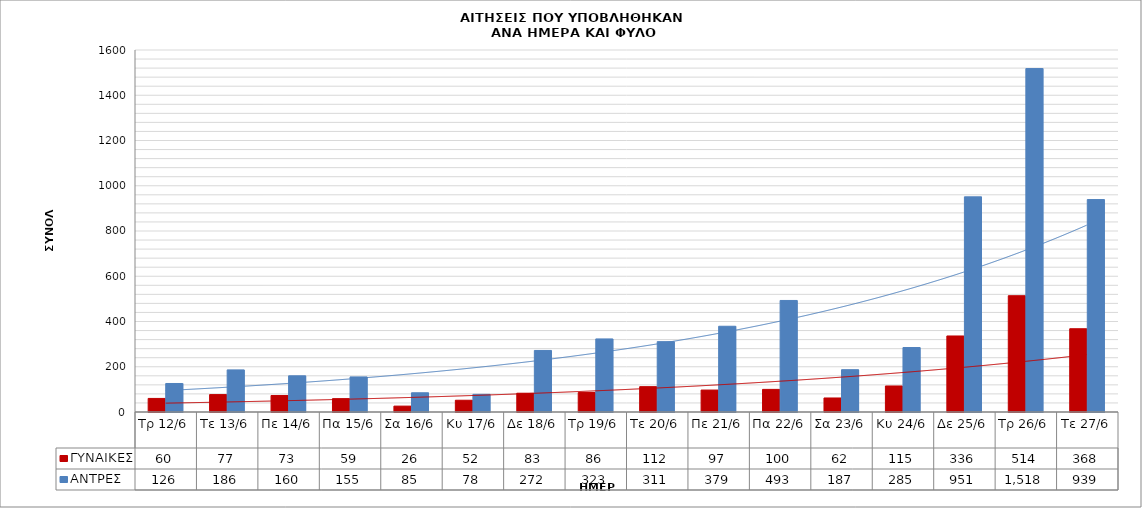
| Category | ΓΥΝΑΙΚΕΣ | ΑΝΤΡΕΣ |
|---|---|---|
| Τρ 12/6 | 60 | 126 |
| Τε 13/6 | 77 | 186 |
| Πε 14/6 | 73 | 160 |
| Πα 15/6 | 59 | 155 |
| Σα 16/6 | 26 | 85 |
| Κυ 17/6 | 52 | 78 |
| Δε 18/6 | 83 | 272 |
| Τρ 19/6 | 86 | 323 |
| Τε 20/6 | 112 | 311 |
| Πε 21/6 | 97 | 379 |
| Πα 22/6 | 100 | 493 |
| Σα 23/6 | 62 | 187 |
| Κυ 24/6 | 115 | 285 |
| Δε 25/6 | 336 | 951 |
| Τρ 26/6 | 514 | 1518 |
| Τε 27/6 | 368 | 939 |